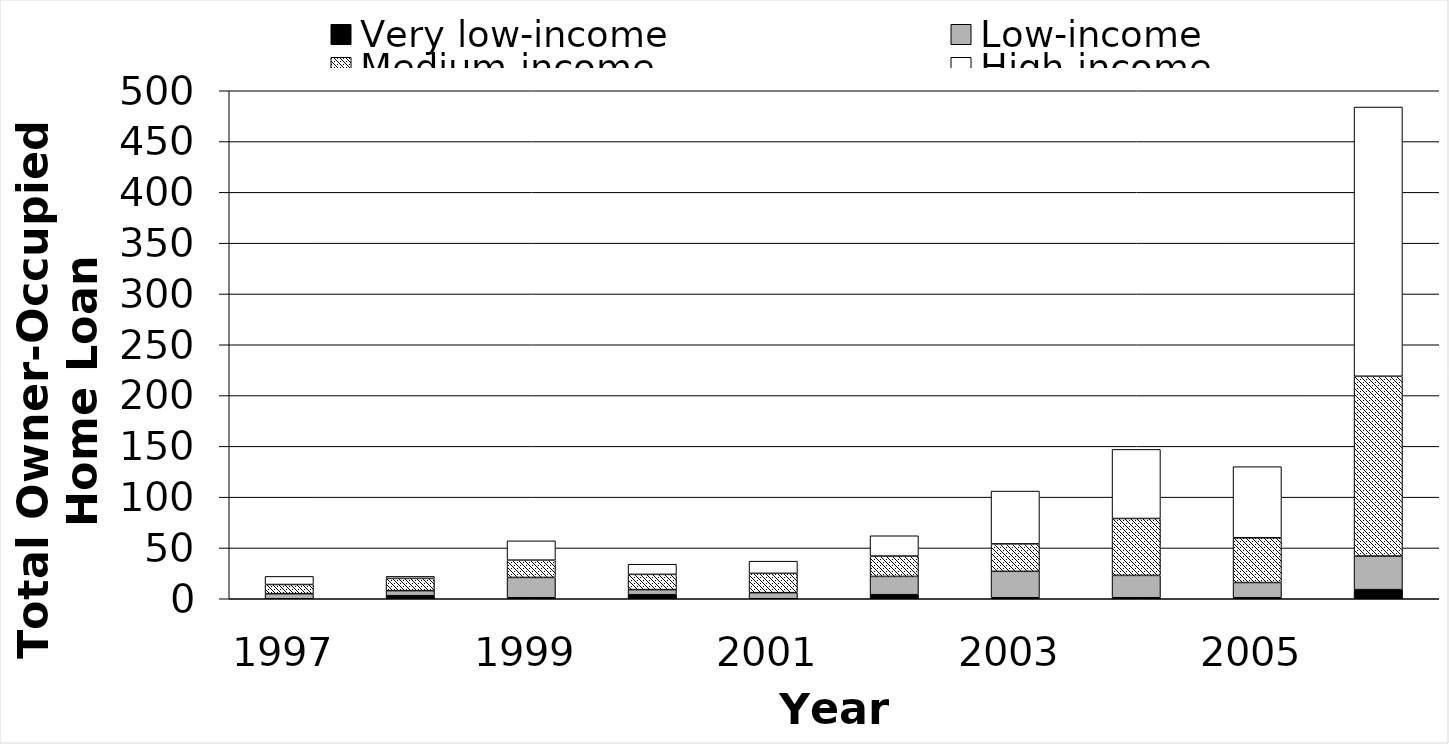
| Category | Very low-income | Low-income | Medium-income | High-income |
|---|---|---|---|---|
| 1997.0 | 0 | 5 | 9 | 8 |
| 1998.0 | 3 | 5 | 12 | 2 |
| 1999.0 | 1 | 20 | 17 | 19 |
| 2000.0 | 4 | 5 | 15 | 10 |
| 2001.0 | 0 | 6 | 19 | 12 |
| 2002.0 | 4 | 18 | 20 | 20 |
| 2003.0 | 1 | 26 | 27 | 52 |
| 2004.0 | 1 | 22 | 56 | 68 |
| 2005.0 | 1 | 15 | 44 | 70 |
| 2006.0 | 9 | 33 | 177 | 265 |